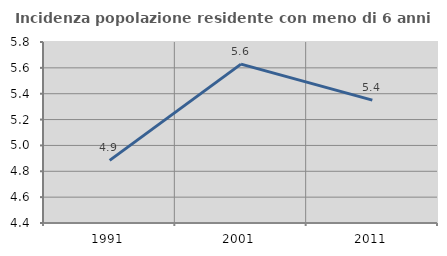
| Category | Incidenza popolazione residente con meno di 6 anni |
|---|---|
| 1991.0 | 4.885 |
| 2001.0 | 5.629 |
| 2011.0 | 5.351 |